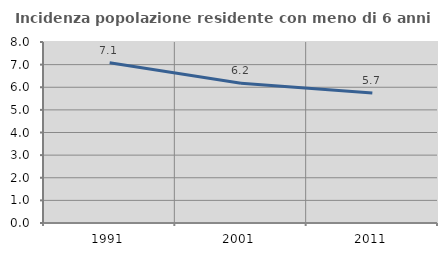
| Category | Incidenza popolazione residente con meno di 6 anni |
|---|---|
| 1991.0 | 7.085 |
| 2001.0 | 6.18 |
| 2011.0 | 5.741 |